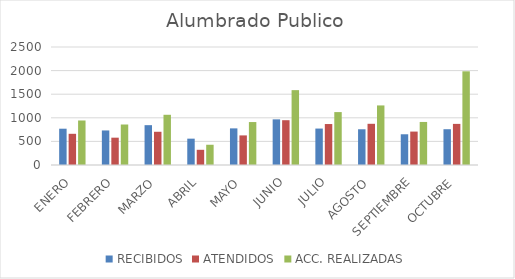
| Category | RECIBIDOS | ATENDIDOS | ACC. REALIZADAS |
|---|---|---|---|
| ENERO | 769 | 661 | 943 |
| FEBRERO | 732 | 579 | 858 |
| MARZO | 844 | 704 | 1064 |
| ABRIL | 558 | 322 | 429 |
| MAYO | 776 | 627 | 910 |
| JUNIO | 967 | 949 | 1586 |
| JULIO | 772 | 868 | 1121 |
| AGOSTO | 757 | 873 | 1262 |
| SEPTIEMBRE | 651 | 708 | 912 |
| OCTUBRE | 758 | 871 | 1985 |